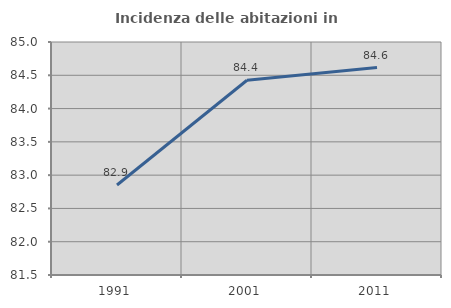
| Category | Incidenza delle abitazioni in proprietà  |
|---|---|
| 1991.0 | 82.852 |
| 2001.0 | 84.425 |
| 2011.0 | 84.615 |